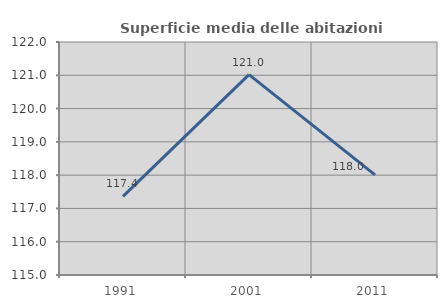
| Category | Superficie media delle abitazioni occupate |
|---|---|
| 1991.0 | 117.36 |
| 2001.0 | 121.019 |
| 2011.0 | 118.006 |